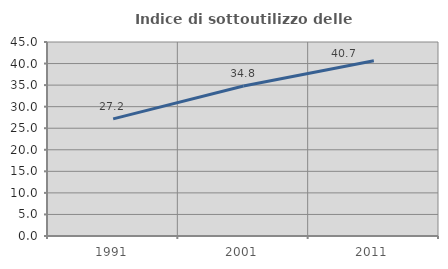
| Category | Indice di sottoutilizzo delle abitazioni  |
|---|---|
| 1991.0 | 27.158 |
| 2001.0 | 34.787 |
| 2011.0 | 40.657 |